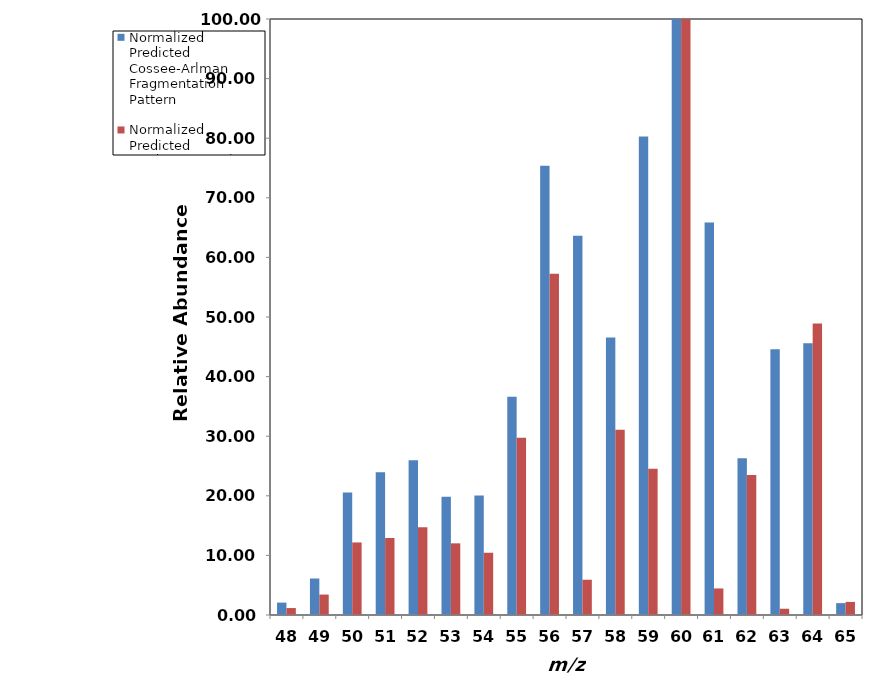
| Category | Normalized Predicted _x000d_Cossee-Arlman _x000d_Fragmentation Pattern | Normalized Predicted _x000d_Oxidative Coupling _x000d_Fragmentation Pattern |
|---|---|---|
| 48.0 | 2.081 | 1.167 |
| 49.0 | 6.122 | 3.43 |
| 50.0 | 20.561 | 12.172 |
| 51.0 | 23.948 | 12.917 |
| 52.0 | 25.967 | 14.727 |
| 53.0 | 19.83 | 12.023 |
| 54.0 | 20.033 | 10.446 |
| 55.0 | 36.604 | 29.747 |
| 56.0 | 75.38 | 57.243 |
| 57.0 | 63.645 | 5.915 |
| 58.0 | 46.57 | 31.081 |
| 59.0 | 80.28 | 24.554 |
| 60.0 | 100 | 100 |
| 61.0 | 65.867 | 4.456 |
| 62.0 | 26.306 | 23.485 |
| 63.0 | 44.593 | 1.051 |
| 64.0 | 45.577 | 48.927 |
| 65.0 | 1.989 | 2.194 |